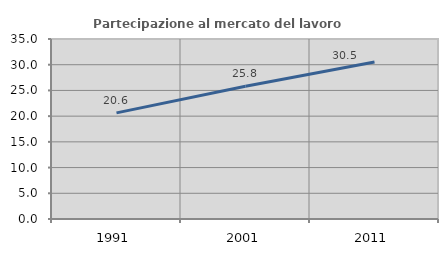
| Category | Partecipazione al mercato del lavoro  femminile |
|---|---|
| 1991.0 | 20.635 |
| 2001.0 | 25.806 |
| 2011.0 | 30.508 |